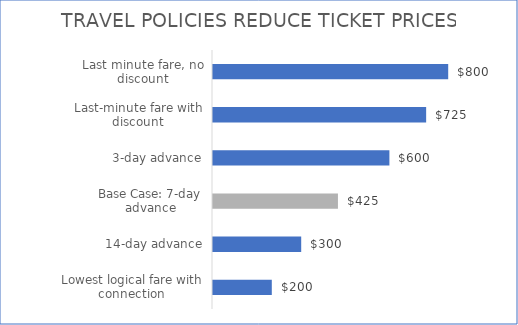
| Category | Illustrative Ticket Price |
|---|---|
| Lowest logical fare with connection | 200 |
| 14-day advance | 300 |
| Base Case: 7-day advance | 425 |
| 3-day advance | 600 |
| Last-minute fare with discount | 725 |
| Last minute fare, no discount | 800 |